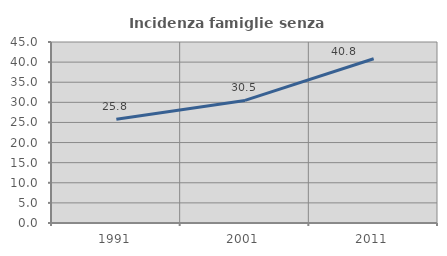
| Category | Incidenza famiglie senza nuclei |
|---|---|
| 1991.0 | 25.798 |
| 2001.0 | 30.471 |
| 2011.0 | 40.823 |